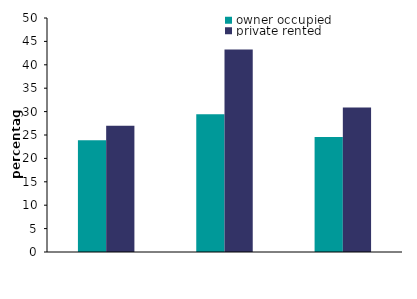
| Category | owner occupied | private rented |
|---|---|---|
| loft 
insulation | 23.86 | 26.975 |
| cavity wall 
insulation | 29.453 | 43.273 |
| hot water cylinder 
insulation | 24.577 | 30.899 |